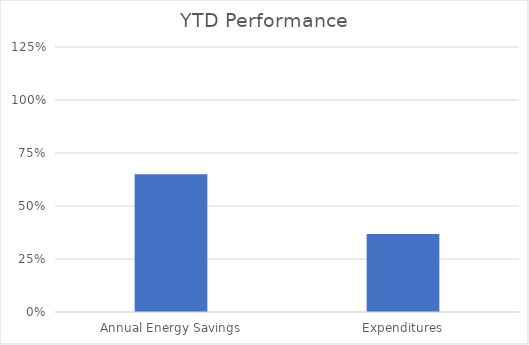
| Category | Series 0 |
|---|---|
| Annual Energy Savings | 0.65 |
| Expenditures | 0.367 |